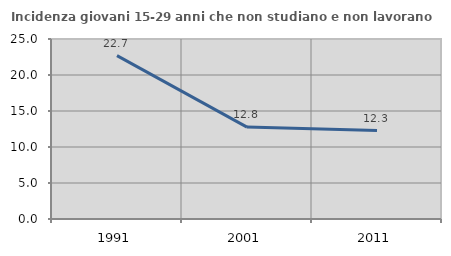
| Category | Incidenza giovani 15-29 anni che non studiano e non lavorano  |
|---|---|
| 1991.0 | 22.695 |
| 2001.0 | 12.766 |
| 2011.0 | 12.281 |